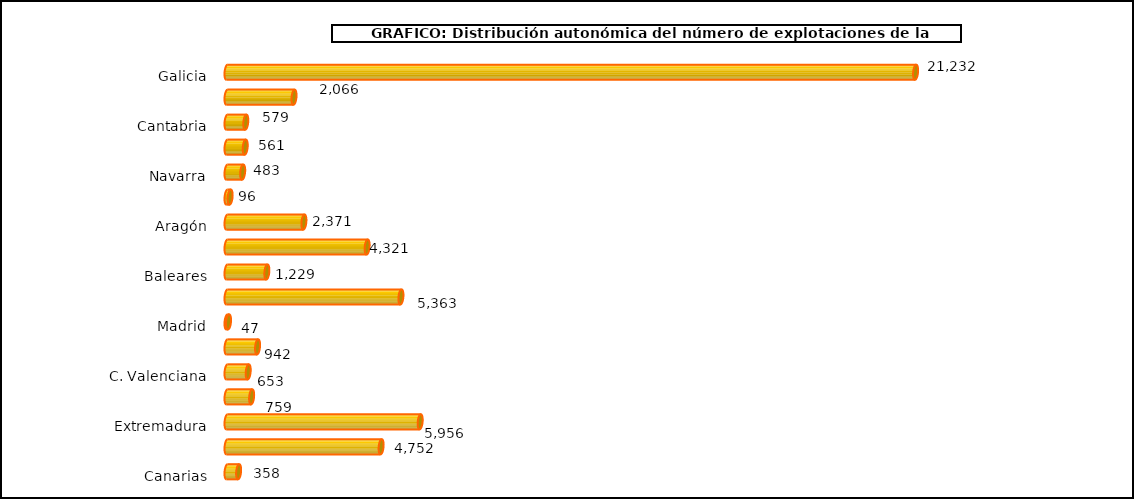
| Category | num. Explotaciones |
|---|---|
|   Galicia | 21232 |
|   P. de Asturias | 2066 |
|   Cantabria | 579 |
|   País Vasco | 561 |
|   Navarra | 483 |
|   La Rioja | 96 |
|   Aragón | 2371 |
|   Cataluña | 4321 |
|   Baleares | 1229 |
|   Castilla y León | 5363 |
|   Madrid | 47 |
|   Castilla – La Mancha | 942 |
|   C. Valenciana | 653 |
|   R. de Murcia | 759 |
|   Extremadura | 5956 |
|   Andalucía | 4752 |
|   Canarias | 358 |